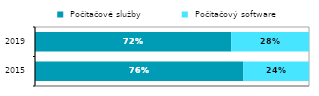
| Category |  Počítačové služby |  Počítačový software |
|---|---|---|
| 2015.0 | 0.761 | 0.239 |
| 2019.0 | 0.716 | 0.284 |